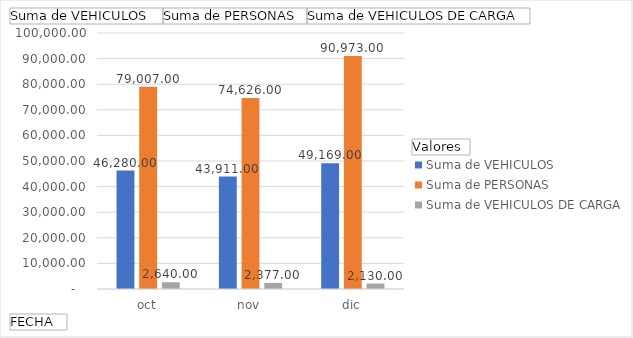
| Category | Suma de VEHICULOS  | Suma de PERSONAS | Suma de VEHICULOS DE CARGA |
|---|---|---|---|
| oct | 46280 | 79007 | 2640 |
| nov | 43911 | 74626 | 2377 |
| dic | 49169 | 90973 | 2130 |